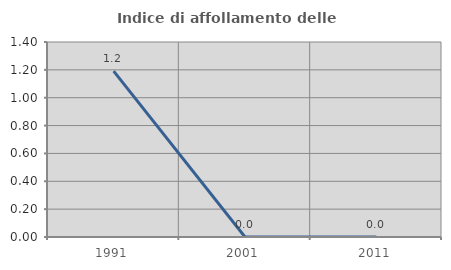
| Category | Indice di affollamento delle abitazioni  |
|---|---|
| 1991.0 | 1.19 |
| 2001.0 | 0 |
| 2011.0 | 0 |